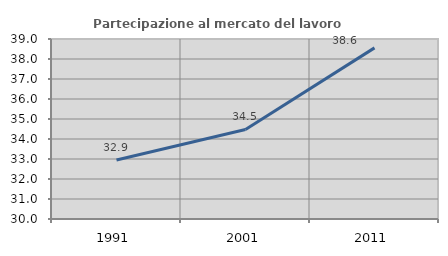
| Category | Partecipazione al mercato del lavoro  femminile |
|---|---|
| 1991.0 | 32.949 |
| 2001.0 | 34.477 |
| 2011.0 | 38.556 |